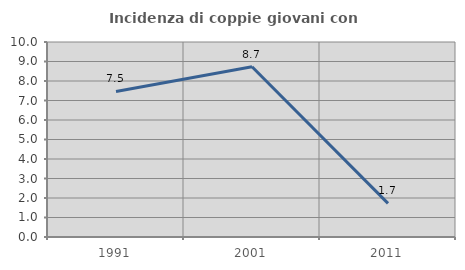
| Category | Incidenza di coppie giovani con figli |
|---|---|
| 1991.0 | 7.463 |
| 2001.0 | 8.73 |
| 2011.0 | 1.724 |